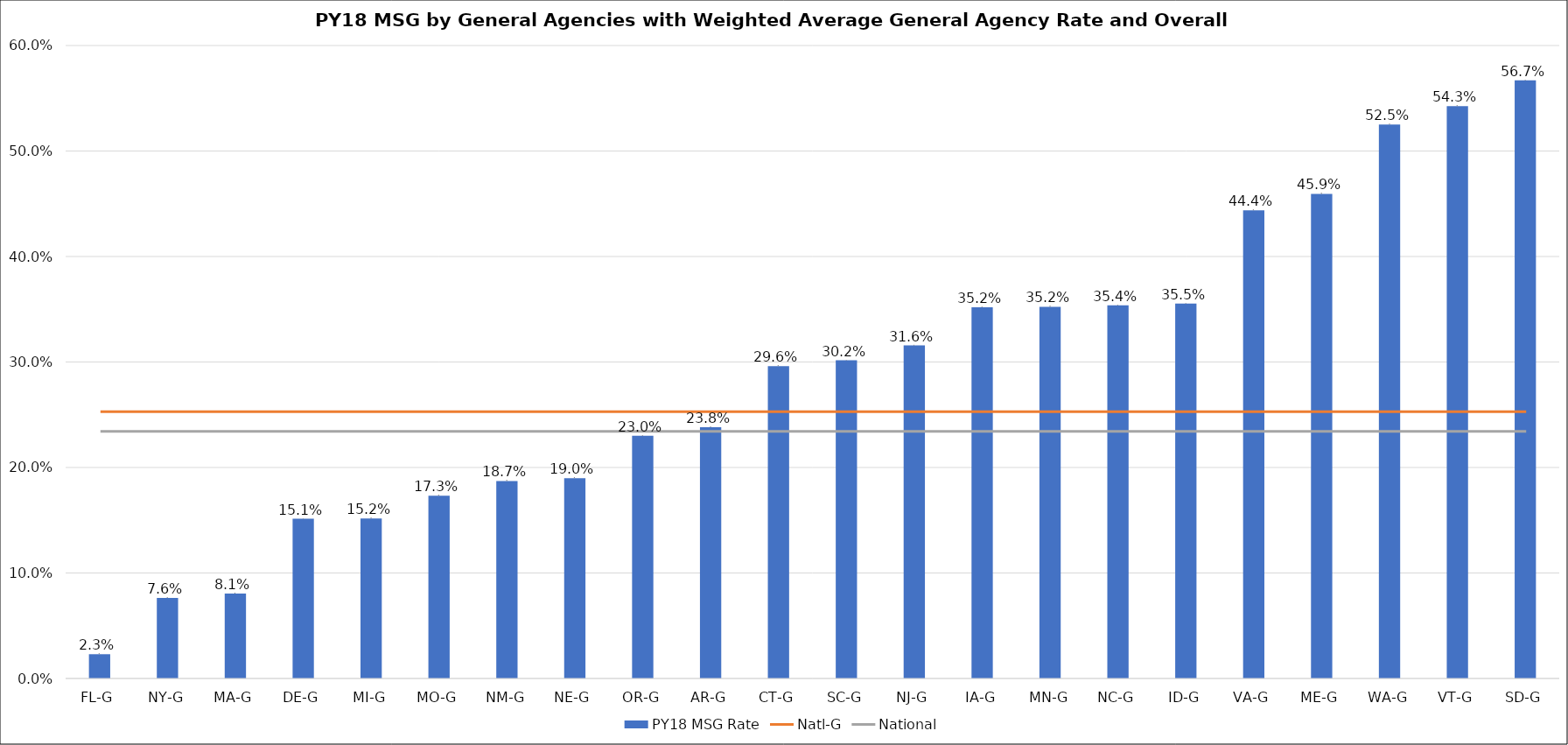
| Category | PY18 MSG Rate |
|---|---|
| FL-G | 0.023 |
| NY-G | 0.076 |
| MA-G | 0.081 |
| DE-G | 0.151 |
| MI-G | 0.152 |
| MO-G | 0.173 |
| NM-G | 0.187 |
| NE-G | 0.19 |
| OR-G | 0.23 |
| AR-G | 0.238 |
| CT-G | 0.296 |
| SC-G | 0.302 |
| NJ-G | 0.316 |
| IA-G | 0.352 |
| MN-G | 0.352 |
| NC-G | 0.354 |
| ID-G | 0.355 |
| VA-G | 0.444 |
| ME-G | 0.459 |
| WA-G | 0.525 |
| VT-G | 0.542 |
| SD-G | 0.567 |